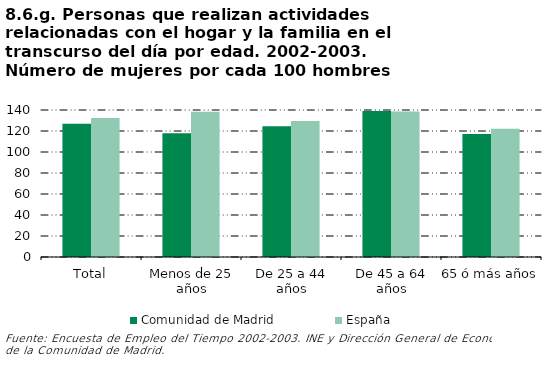
| Category | Comunidad de Madrid | España |
|---|---|---|
| Total | 126.86 | 132.429 |
| Menos de 25 años | 117.802 | 138.408 |
| De 25 a 44 años | 124.601 | 129.62 |
| De 45 a 64 años | 138.976 | 138.669 |
| 65 ó más años | 117.212 | 122.193 |